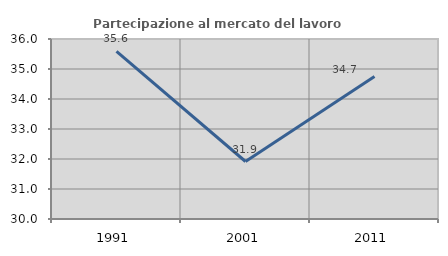
| Category | Partecipazione al mercato del lavoro  femminile |
|---|---|
| 1991.0 | 35.585 |
| 2001.0 | 31.916 |
| 2011.0 | 34.748 |